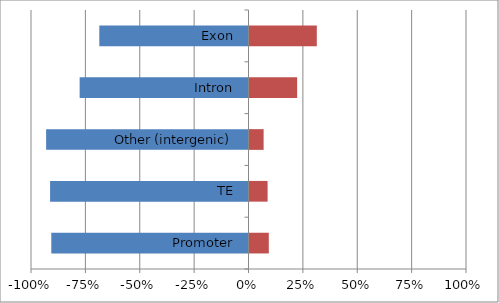
| Category | Series 0 | Series 1 |
|---|---|---|
| Promoter | -0.907 | 0.093 |
| TE | -0.912 | 0.088 |
| Other (intergenic) | -0.93 | 0.07 |
| Intron | -0.776 | 0.224 |
| Exon | -0.686 | 0.314 |